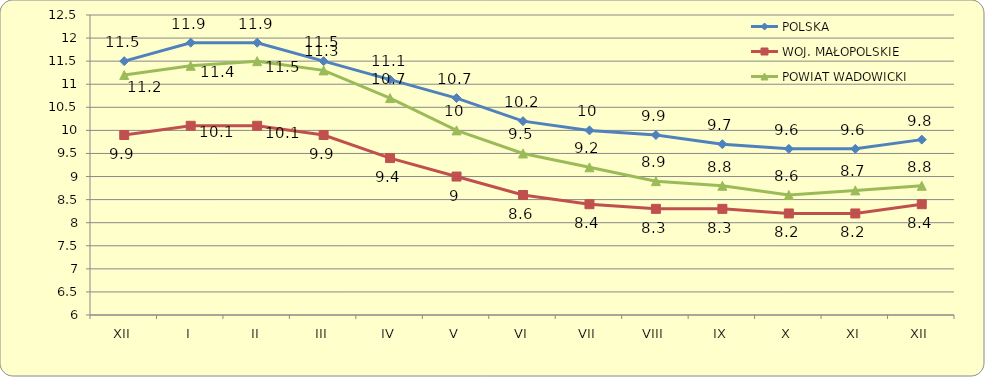
| Category | POLSKA | WOJ. MAŁOPOLSKIE | POWIAT WADOWICKI |
|---|---|---|---|
| XII | 11.5 | 9.9 | 11.2 |
| I | 11.9 | 10.1 | 11.4 |
| II | 11.9 | 10.1 | 11.5 |
| III | 11.5 | 9.9 | 11.3 |
| IV | 11.1 | 9.4 | 10.7 |
| V | 10.7 | 9 | 10 |
| VI | 10.2 | 8.6 | 9.5 |
| VII | 10 | 8.4 | 9.2 |
| VIII | 9.9 | 8.3 | 8.9 |
| IX | 9.7 | 8.3 | 8.8 |
| X | 9.6 | 8.2 | 8.6 |
| XI | 9.6 | 8.2 | 8.7 |
| XII | 9.8 | 8.4 | 8.8 |